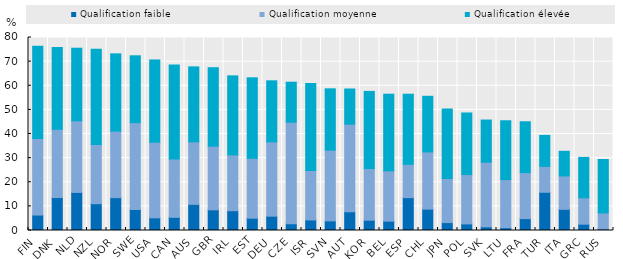
| Category | Qualification faible | Qualification moyenne | Qualification élevée |
|---|---|---|---|
| FIN | 6.401 | 31.719 | 38.259 |
| DNK | 13.685 | 28.27 | 33.911 |
| NLD | 15.794 | 29.68 | 30.085 |
| NZL | 11.1 | 24.549 | 39.45 |
| NOR | 13.612 | 27.58 | 32.025 |
| SWE | 8.736 | 35.96 | 27.722 |
| USA | 5.256 | 31.324 | 34.105 |
| CAN | 5.458 | 24.229 | 38.866 |
| AUS | 10.841 | 25.922 | 31.052 |
| GBR | 8.572 | 26.367 | 32.539 |
| IRL | 8.201 | 23.138 | 32.757 |
| EST | 5.106 | 24.816 | 33.373 |
| DEU | 5.937 | 30.794 | 25.312 |
| CZE | 2.778 | 42.109 | 16.591 |
| ISR | 4.37 | 20.474 | 36.081 |
| SVN | 3.998 | 29.317 | 25.409 |
| AUT | 7.774 | 36.31 | 14.564 |
| KOR | 4.265 | 21.42 | 31.976 |
| BEL | 3.886 | 20.838 | 31.773 |
| ESP | 13.617 | 13.817 | 29.056 |
| CHL | 8.852 | 23.715 | 23.064 |
| JPN | 3.279 | 18.269 | 28.814 |
| POL | 2.734 | 20.455 | 25.53 |
| SVK | 1.523 | 26.8 | 17.469 |
| LTU | 1.15 | 19.955 | 24.386 |
| FRA | 4.925 | 19.074 | 21.08 |
| TUR | 15.842 | 10.739 | 12.843 |
| ITA | 8.772 | 13.845 | 10.213 |
| GRC | 2.615 | 10.944 | 16.734 |
| RUS | 0.621 | 6.667 | 22.131 |